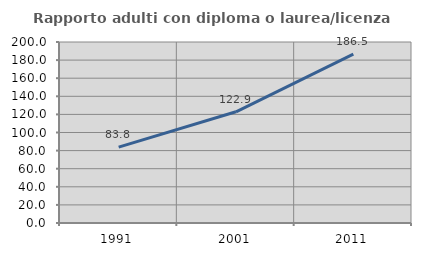
| Category | Rapporto adulti con diploma o laurea/licenza media  |
|---|---|
| 1991.0 | 83.81 |
| 2001.0 | 122.864 |
| 2011.0 | 186.511 |